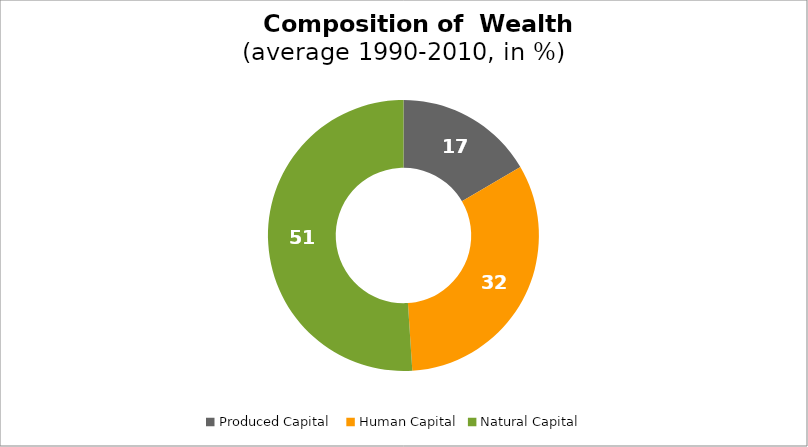
| Category | Series 0 |
|---|---|
| Produced Capital  | 16.559 |
| Human Capital | 32.404 |
| Natural Capital | 51.036 |